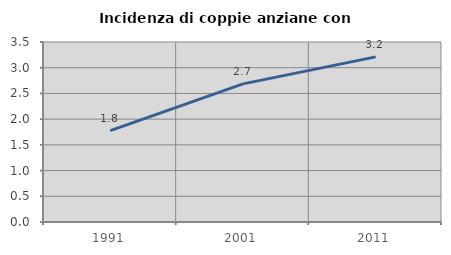
| Category | Incidenza di coppie anziane con figli |
|---|---|
| 1991.0 | 1.778 |
| 2001.0 | 2.686 |
| 2011.0 | 3.211 |